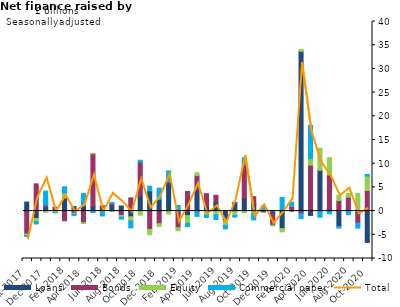
| Category | Loans | Bonds | Equity | Commercial paper |
|---|---|---|---|---|
| Oct-2017 | 1.903 | -4.847 | -0.312 | -0.197 |
| Nov-2017 | -1.557 | 5.749 | -0.657 | -0.5 |
| Dec-2017 | 0.881 | 0.379 | -0.254 | 2.954 |
| Jan-2018 | 0.689 | 0.093 | -0.248 | -0.116 |
| Feb-2018 | 2.795 | -2.027 | 1.03 | 1.309 |
| Mar-2018 | 0.936 | -0.433 | -0.173 | -0.357 |
| Apr-2018 | 1.173 | -2.435 | -0.186 | 2.532 |
| May-2018 | 1.041 | 11.031 | 0.114 | -0.33 |
| Jun-2018 | 0.819 | 0.294 | -0.048 | -0.977 |
| Jul-2018 | 1.107 | 0.494 | -0.042 | 0.233 |
| Aug-2018 | 1.083 | -0.932 | -0.332 | -0.431 |
| Sep-2018 | -1.178 | 2.795 | -0.879 | -1.484 |
| Oct-2018 | 3.227 | 7.138 | -0.854 | 0.363 |
| Nov-2018 | 4.302 | -3.846 | -1.13 | 0.958 |
| Dec-2018 | 2.437 | -2.65 | -0.576 | 2.407 |
| Jan-2019 | 5.997 | 0.161 | -0.608 | 2.312 |
| Feb-2019 | -0.401 | -3.084 | -0.649 | 1.181 |
| Mar-2019 | -0.949 | 4.131 | -1.638 | -0.683 |
| Apr-2019 | 4.577 | 2.92 | 0.579 | -1.109 |
| May-2019 | 1.053 | 2.622 | -0.794 | -0.561 |
| Jun-2019 | 1.905 | 1.437 | -0.767 | -1.001 |
| Jul-2019 | -1.763 | -0.281 | -0.969 | -0.742 |
| Aug-2019 | 1.677 | 0.174 | -0.912 | -0.357 |
| Sep-2019 | 2.709 | 6.981 | -0.313 | 1.548 |
| Oct-2019 | 1.396 | 1.651 | -0.44 | -1.416 |
| Nov-2019 | 0.354 | -0.195 | 0.05 | 0.654 |
| Dec-2019 | -0.57 | -2.415 | -0.113 | 0.031 |
| Jan-2020 | -3.691 | 0.155 | -0.684 | 2.731 |
| Feb-2020 | 0.282 | 0.764 | 0.02 | 0.826 |
| Mar-2020 | 33.715 | -0.54 | 0.361 | -1.041 |
| Apr-2020 | -0.912 | 9.698 | 1.357 | 7.014 |
| May-2020 | 8.491 | 0.131 | 4.647 | -1.303 |
| Jun-2020 | 0.121 | 7.494 | 3.661 | -0.564 |
| Jul-2020 | -3.246 | 2.212 | 1.101 | -0.34 |
| Aug-2020 | 0.316 | 2.614 | 0.834 | -0.762 |
| Sep-2020 | -0.424 | -2.122 | 3.704 | -1.058 |
| Oct-2020 | -6.61 | 4.349 | 3.037 | 0.366 |